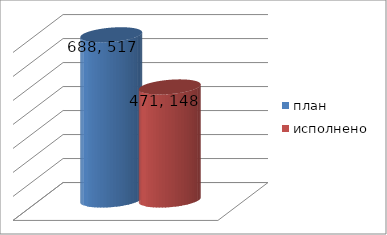
| Category | план | исполнено |
|---|---|---|
| 0 | 688517336.66 | 471148698.4 |